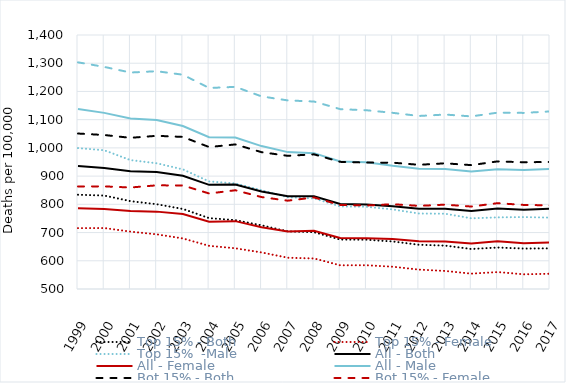
| Category | Top 15% - Both | Top 15% - Female | Top 15%  -Male | All - Both | All - Female | All - Male | Bot 15% - Both | Bot 15% - Female | Bot 15% - Male |
|---|---|---|---|---|---|---|---|---|---|
| 1999.0 | 833.992 | 715.671 | 999.271 | 935.85 | 785.978 | 1138.179 | 1050.873 | 863.337 | 1303.158 |
| 2000.0 | 831.106 | 715.965 | 991.537 | 928.688 | 783.054 | 1124.053 | 1045.607 | 863.619 | 1287.003 |
| 2001.0 | 811.346 | 703.314 | 956.727 | 917.625 | 776.802 | 1104.134 | 1035.66 | 859.65 | 1267.007 |
| 2002.0 | 800.371 | 693.735 | 945.495 | 914.213 | 774.16 | 1099.132 | 1042.819 | 867.331 | 1271.647 |
| 2003.0 | 783.628 | 679.083 | 923.898 | 901.044 | 765.381 | 1077.317 | 1038.901 | 866.856 | 1259.307 |
| 2004.0 | 751.149 | 653.057 | 881.081 | 869.018 | 738.57 | 1037.955 | 1002.968 | 838.444 | 1212.173 |
| 2005.0 | 743.956 | 644.266 | 874.177 | 870.597 | 740.483 | 1036.809 | 1012.269 | 849.851 | 1216.299 |
| 2006.0 | 725.615 | 629.552 | 850.235 | 845.704 | 718.925 | 1006.382 | 984.876 | 825.739 | 1182.487 |
| 2007.0 | 704.119 | 610.802 | 825.13 | 828.261 | 703.763 | 985.028 | 971.888 | 812.969 | 1168.231 |
| 2008.0 | 701.296 | 608.231 | 820.912 | 828.412 | 706.001 | 981.401 | 977.135 | 824.409 | 1164.261 |
| 2009.0 | 675.164 | 584.057 | 792.811 | 801.368 | 681.119 | 952.044 | 950.502 | 797.632 | 1137.33 |
| 2010.0 | 674.723 | 584.166 | 791.304 | 799.46 | 679.814 | 949.03 | 947.93 | 795.88 | 1133.36 |
| 2011.0 | 668.398 | 578.99 | 782.03 | 793.364 | 677.083 | 936.41 | 947.64 | 800.409 | 1124.232 |
| 2012.0 | 656.855 | 568.748 | 767.495 | 784.751 | 669.076 | 926.281 | 940.075 | 794.579 | 1113.095 |
| 2013.0 | 653.75 | 563.949 | 766.715 | 784.062 | 668.11 | 924.853 | 945.298 | 798.878 | 1118.137 |
| 2014.0 | 641.699 | 554.395 | 750.462 | 776.562 | 660.988 | 916.221 | 938.921 | 792.165 | 1111.617 |
| 2015.0 | 646.991 | 560.046 | 753.826 | 785.597 | 669.322 | 924.504 | 952.15 | 804.089 | 1124.83 |
| 2016.0 | 643.251 | 552.055 | 754.912 | 780.79 | 662.257 | 921.716 | 949.014 | 797.879 | 1124.001 |
| 2017.0 | 644.166 | 554.062 | 752.833 | 784.283 | 664.899 | 925.43 | 950.199 | 796.463 | 1129.171 |